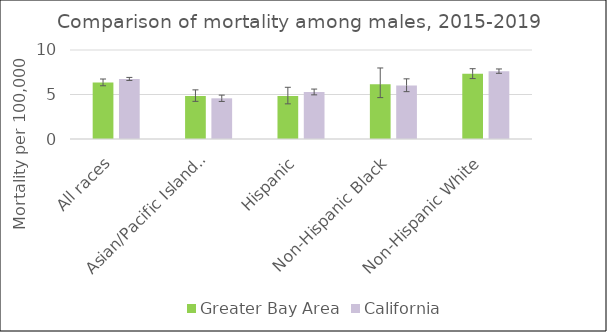
| Category | Greater Bay Area | California | US Mortality |
|---|---|---|---|
| All races | 6.35 | 6.75 |  |
| Asian/Pacific Islander | 4.84 | 4.57 |  |
| Hispanic | 4.82 | 5.28 |  |
| Non-Hispanic Black | 6.15 | 6.01 |  |
| Non-Hispanic White | 7.33 | 7.62 |  |